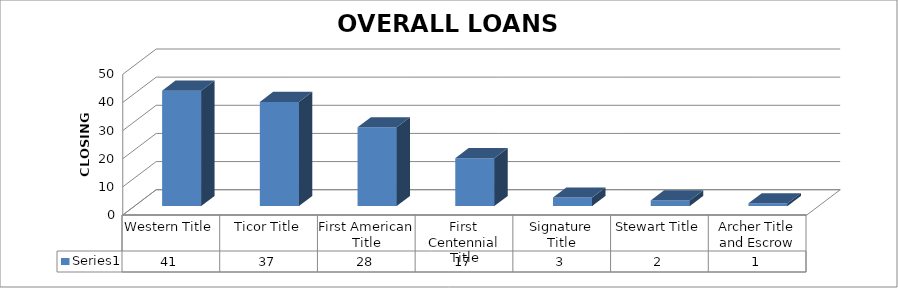
| Category | Series 0 |
|---|---|
| Western Title | 41 |
| Ticor Title | 37 |
| First American Title | 28 |
| First Centennial Title | 17 |
| Signature Title | 3 |
| Stewart Title | 2 |
| Archer Title and Escrow | 1 |